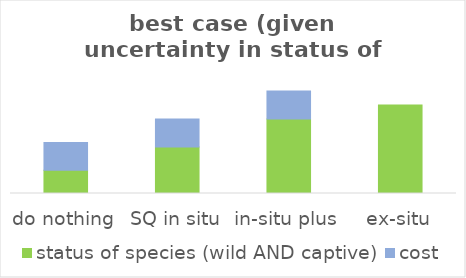
| Category | status of species (wild AND captive) | cost |
|---|---|---|
| do nothing | 0.191 | 0.231 |
| SQ in situ | 0.385 | 0.231 |
| in-situ plus | 0.615 | 0.231 |
| ex-situ | 0.732 | 0 |